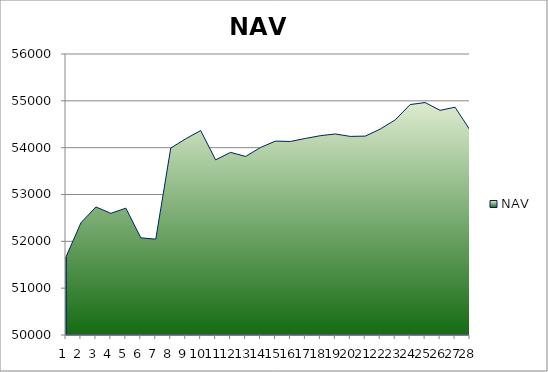
| Category | NAV |
|---|---|
| 0 | 51667 |
| 1 | 52397 |
| 2 | 52733.957 |
| 3 | 52597.875 |
| 4 | 52708.772 |
| 5 | 52075.184 |
| 6 | 52046.775 |
| 7 | 53991.219 |
| 8 | 54189.909 |
| 9 | 54364.909 |
| 10 | 53739.909 |
| 11 | 53899.542 |
| 12 | 53812.294 |
| 13 | 54003.961 |
| 14 | 54140.037 |
| 15 | 54132.37 |
| 16 | 54197.37 |
| 17 | 54255.812 |
| 18 | 54292.622 |
| 19 | 54240.699 |
| 20 | 54246.834 |
| 21 | 54397.391 |
| 22 | 54592.197 |
| 23 | 54920.119 |
| 24 | 54963.245 |
| 25 | 54796.799 |
| 26 | 54863.963 |
| 27 | 54375.975 |